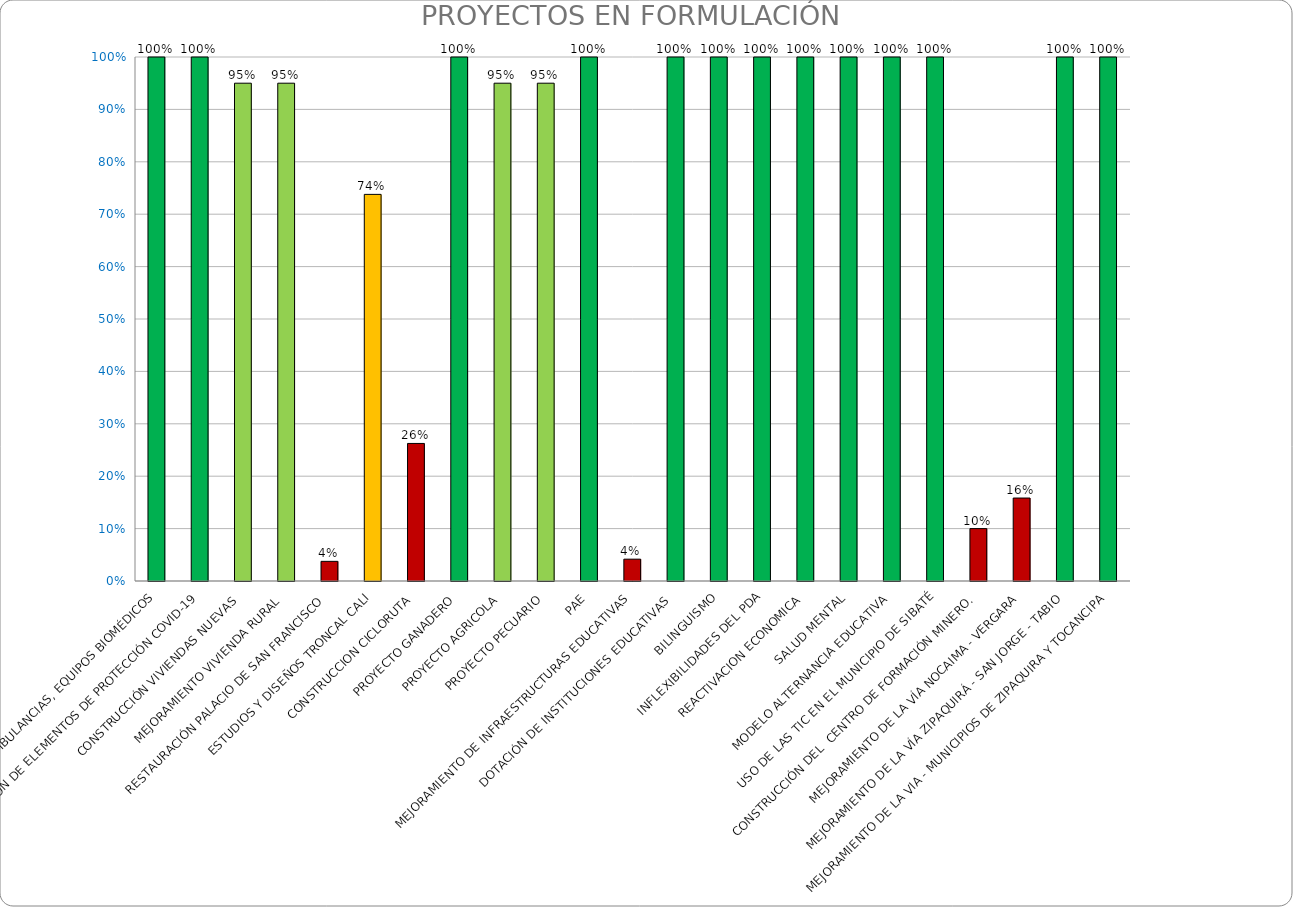
| Category | % AVANCE |
|---|---|
| ADQUISICIÓN DE AMBULANCIAS, EQUIPOS BIOMÉDICOS | 1 |
| ADQUISICIÓN DE ELEMENTOS DE PROTECCIÓN COVID-19 | 1 |
| CONSTRUCCIÓN VIVIENDAS NUEVAS  | 0.95 |
| MEJORAMIENTO VIVIENDA RURAL  | 0.95 |
| RESTAURACIÓN PALACIO DE SAN FRANCISCO  | 0.038 |
| ESTUDIOS Y DISEÑOS TRONCAL CALI | 0.738 |
| CONSTRUCCION CICLORUTA | 0.262 |
| PROYECTO GANADERO | 1 |
| PROYECTO AGRICOLA | 0.95 |
| PROYECTO PECUARIO | 0.95 |
| PAE | 1 |
| MEJORAMIENTO DE INFRAESTRUCTURAS EDUCATIVAS | 0.042 |
| DOTACIÓN DE INSTITUCIONES EDUCATIVAS  | 1 |
| BILINGUISMO | 1 |
| INFLEXIBILIDADES DEL PDA | 1 |
| REACTIVACION ECONOMICA | 1 |
| SALUD MENTAL | 1 |
| MODELO ALTERNANCIA EDUCATIVA | 1 |
| USO DE LAS TIC EN EL MUNICIPIO DE SIBATÉ | 1 |
| CONSTRUCCIÓN DEL  CENTRO DE FORMACIÓN MINERO. | 0.1 |
| MEJORAMIENTO DE LA VÍA NOCAIMA - VERGARA | 0.158 |
| MEJORAMIENTO DE LA VÍA ZIPAQUIRÁ - SAN JORGE - TABIO | 1 |
| MEJORAMIENTO DE LA VIA - MUNICIPIOS DE ZIPAQUIRA Y TOCANCIPA | 1 |